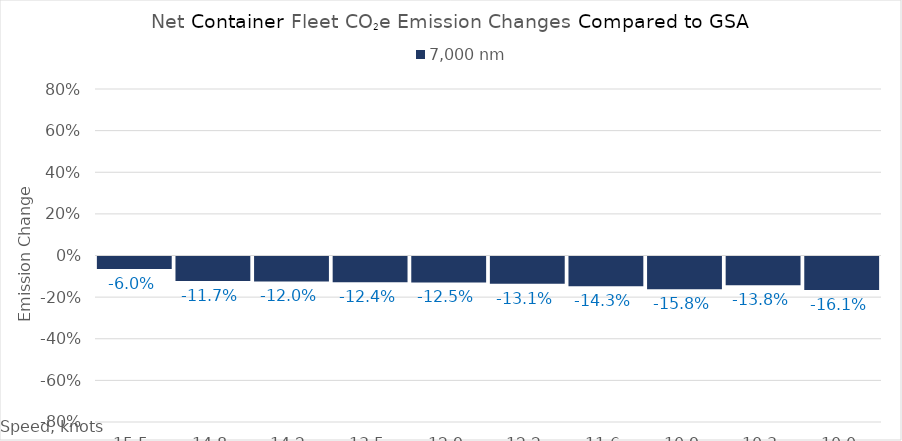
| Category | 7,000 |
|---|---|
| 15.450000000000001 | -0.06 |
| 14.8 | -0.117 |
| 14.15 | -0.12 |
| 13.5 | -0.124 |
| 12.85 | -0.125 |
| 12.2 | -0.131 |
| 11.549999999999999 | -0.143 |
| 10.899999999999999 | -0.158 |
| 10.249999999999998 | -0.138 |
| 10.0 | -0.161 |